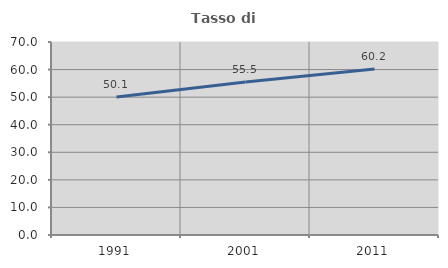
| Category | Tasso di occupazione   |
|---|---|
| 1991.0 | 50.057 |
| 2001.0 | 55.463 |
| 2011.0 | 60.229 |